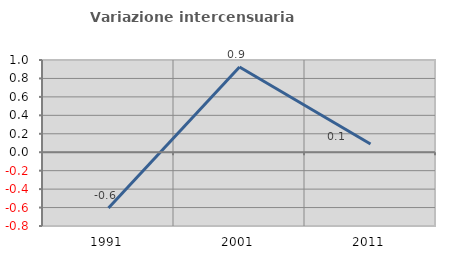
| Category | Variazione intercensuaria annua |
|---|---|
| 1991.0 | -0.604 |
| 2001.0 | 0.923 |
| 2011.0 | 0.089 |